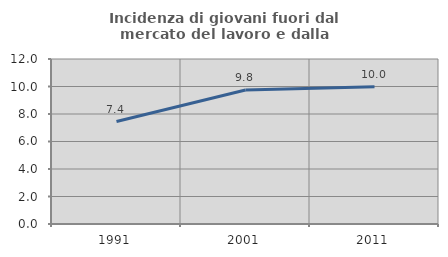
| Category | Incidenza di giovani fuori dal mercato del lavoro e dalla formazione  |
|---|---|
| 1991.0 | 7.449 |
| 2001.0 | 9.751 |
| 2011.0 | 9.98 |